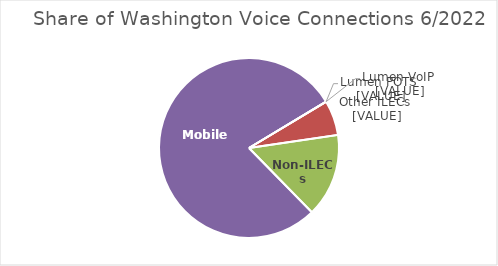
| Category | Series 0 |
|---|---|
| Lumen - POTS | 0 |
| Other ILECs | 0.063 |
| Non-ILECs | 0.15 |
| Mobile | 0.787 |
| Lumen - VoIP | 0 |